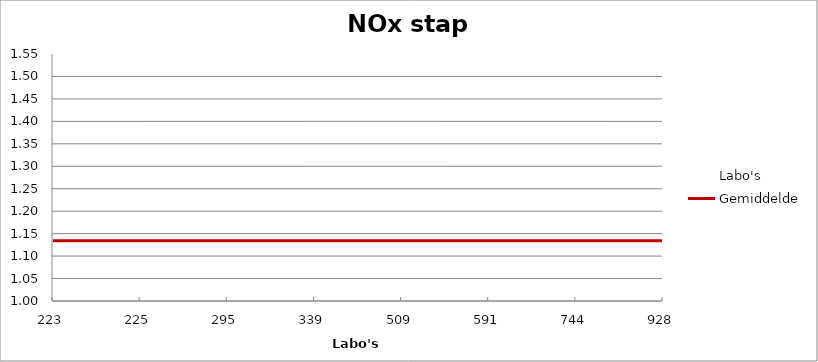
| Category | Labo's | Gemiddelde |
|---|---|---|
| 223.0 | 1.204 | 1.134 |
| 225.0 | 1.133 | 1.134 |
| 295.0 | 1.158 | 1.134 |
| 339.0 | 1.141 | 1.134 |
| 509.0 | 1.112 | 1.134 |
| 591.0 | 1.095 | 1.134 |
| 744.0 | 1.095 | 1.134 |
| 928.0 | 1.543 | 1.134 |